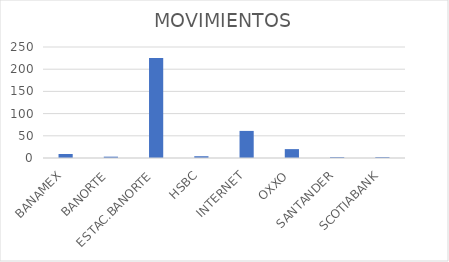
| Category | MOVIMIENTOS |
|---|---|
| BANAMEX | 9 |
| BANORTE | 3 |
| ESTAC.BANORTE | 225 |
| HSBC | 4 |
| INTERNET | 61 |
| OXXO | 20 |
| SANTANDER | 2 |
| SCOTIABANK | 2 |